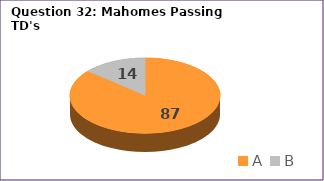
| Category | Series 0 |
|---|---|
| A | 87 |
| B | 14 |